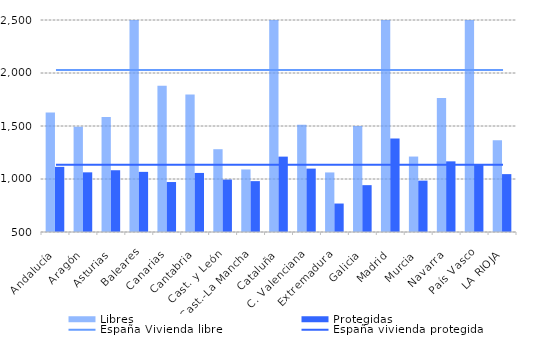
| Category | Libres | Protegidas |
|---|---|---|
| Andalucía | 1627.05 | 1114.5 |
| Aragón | 1492.8 | 1062.875 |
| Asturias | 1584.95 | 1082.625 |
| Baleares | 2963.75 | 1067.275 |
| Canarias | 1880.2 | 971.425 |
| Cantabria | 1797.7 | 1057.175 |
| Cast. y León | 1281.15 | 994.625 |
| Cast.-La Mancha | 1090.125 | 979.85 |
| Cataluña | 2505.95 | 1211.075 |
| C. Valenciana | 1511.15 | 1098.075 |
| Extremadura | 1062.025 | 768.6 |
| Galicia | 1500.375 | 941.925 |
| Madrid | 3252.175 | 1382.075 |
| Murcia | 1211.825 | 984.6 |
| Navarra | 1763.325 | 1166.525 |
| País Vasco | 2989.275 | 1139.8 |
| LA RIOJA | 1365 | 1046.1 |